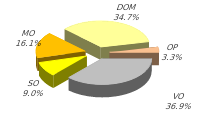
| Category | Series 0 |
|---|---|
| VO | 299736.6 |
| SO | 73290.4 |
| MO | 131320.328 |
| DOM | 282050.7 |
| OP | 26800.828 |